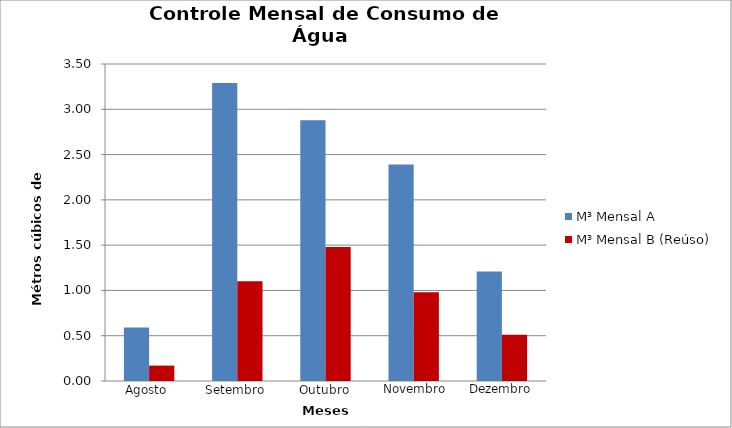
| Category | M³ Mensal A  | M³ Mensal B (Reúso) |
|---|---|---|
| 0 | 0.59 | 0.17 |
| 1 | 3.29 | 1.1 |
| 2 | 2.88 | 1.48 |
| 3 | 2.39 | 0.98 |
| 4 | 1.21 | 0.51 |